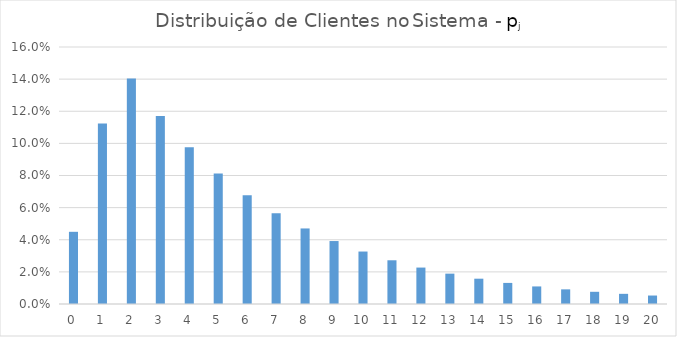
| Category | pj |
|---|---|
| 0.0 | 0.045 |
| 1.0 | 0.112 |
| 2.0 | 0.14 |
| 3.0 | 0.117 |
| 4.0 | 0.098 |
| 5.0 | 0.081 |
| 6.0 | 0.068 |
| 7.0 | 0.056 |
| 8.0 | 0.047 |
| 9.0 | 0.039 |
| 10.0 | 0.033 |
| 11.0 | 0.027 |
| 12.0 | 0.023 |
| 13.0 | 0.019 |
| 14.0 | 0.016 |
| 15.0 | 0.013 |
| 16.0 | 0.011 |
| 17.0 | 0.009 |
| 18.0 | 0.008 |
| 19.0 | 0.006 |
| 20.0 | 0.005 |